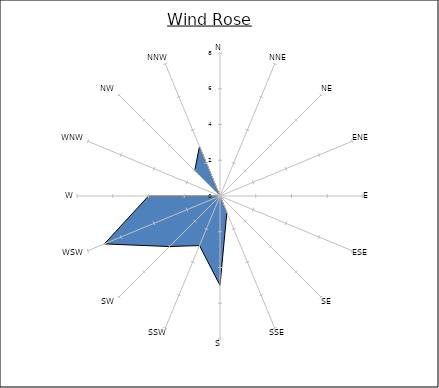
| Category | Series 0 |
|---|---|
| N | 0 |
| NNE | 0 |
| NE | 0 |
| ENE | 0 |
| E | 0 |
| ESE | 0 |
| SE | 0 |
| SSE | 1 |
| S | 5 |
| SSW | 3 |
| SW | 4 |
| WSW | 7 |
| W | 4 |
| WNW | 0 |
| NW | 2 |
| NNW | 3 |